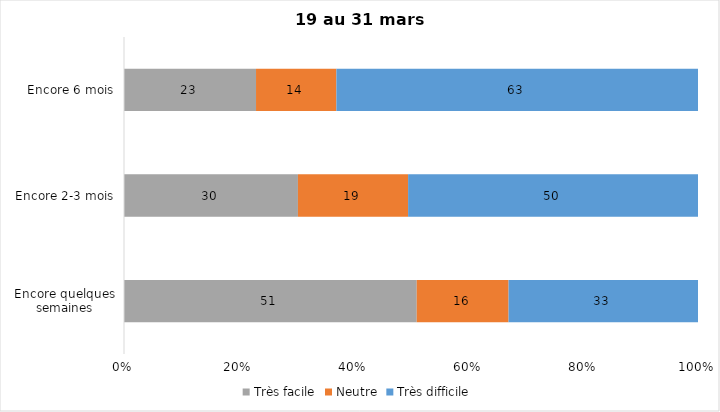
| Category | Très facile | Neutre | Très difficile |
|---|---|---|---|
| Encore quelques semaines | 51 | 16 | 33 |
| Encore 2-3 mois | 30 | 19 | 50 |
| Encore 6 mois | 23 | 14 | 63 |